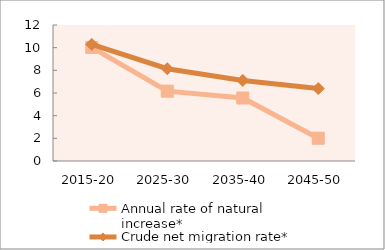
| Category | Annual rate of natural increase* | Crude net migration rate* |
|---|---|---|
| 2015-20 | 10.019 | 10.288 |
| 2025-30 | 6.161 | 8.14 |
| 2035-40 | 5.56 | 7.108 |
| 2045-50 | 2.01 | 6.392 |